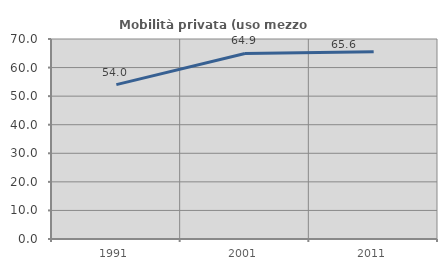
| Category | Mobilità privata (uso mezzo privato) |
|---|---|
| 1991.0 | 54.027 |
| 2001.0 | 64.942 |
| 2011.0 | 65.571 |